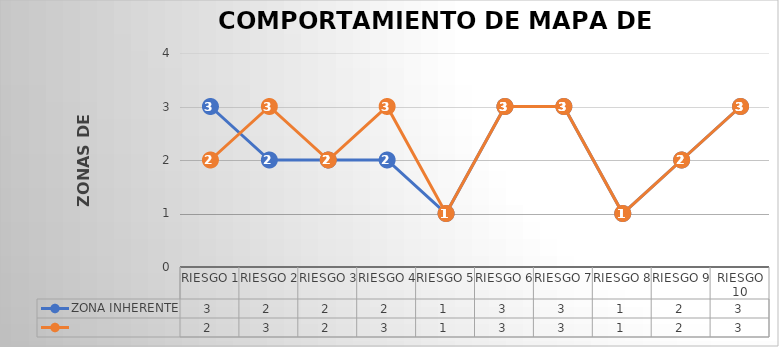
| Category | ZONA INHERENTE | Series 1 |
|---|---|---|
| RIESGO 1 | 3 | 2 |
| RIESGO 2 | 2 | 3 |
| RIESGO 3 | 2 | 2 |
| RIESGO 4 | 2 | 3 |
| RIESGO 5 | 1 | 1 |
| RIESGO 6 | 3 | 3 |
| RIESGO 7 | 3 | 3 |
| RIESGO 8 | 1 | 1 |
| RIESGO 9 | 2 | 2 |
| RIESGO 10 | 3 | 3 |